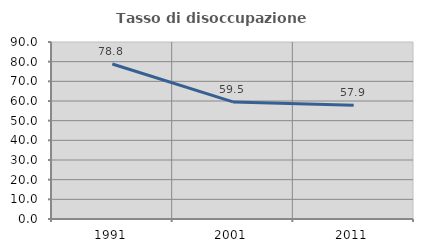
| Category | Tasso di disoccupazione giovanile  |
|---|---|
| 1991.0 | 78.788 |
| 2001.0 | 59.524 |
| 2011.0 | 57.895 |